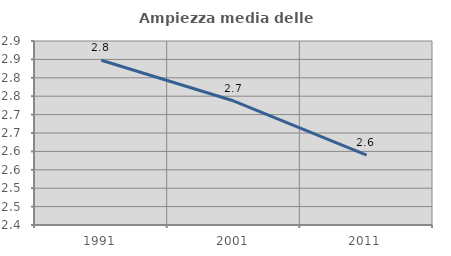
| Category | Ampiezza media delle famiglie |
|---|---|
| 1991.0 | 2.848 |
| 2001.0 | 2.737 |
| 2011.0 | 2.59 |